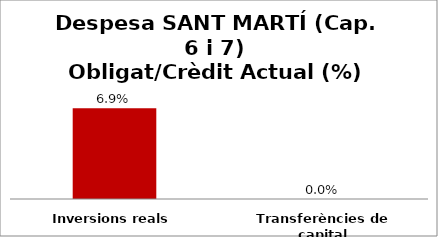
| Category | Series 0 |
|---|---|
| Inversions reals | 0.069 |
| Transferències de capital | 0 |